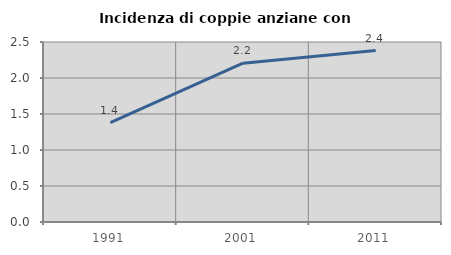
| Category | Incidenza di coppie anziane con figli |
|---|---|
| 1991.0 | 1.379 |
| 2001.0 | 2.206 |
| 2011.0 | 2.381 |